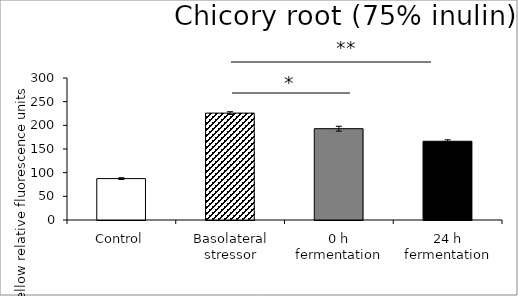
| Category | average |
|---|---|
| Control | 87.466 |
| Basolateral stressor | 225.856 |
| 0 h fermentation | 192.934 |
| 24 h fermentation | 166.338 |